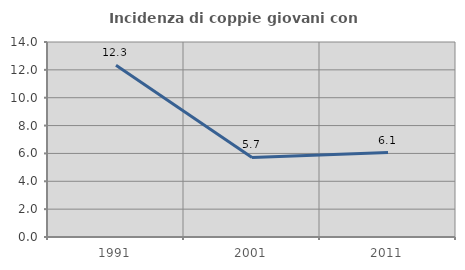
| Category | Incidenza di coppie giovani con figli |
|---|---|
| 1991.0 | 12.329 |
| 2001.0 | 5.714 |
| 2011.0 | 6.061 |